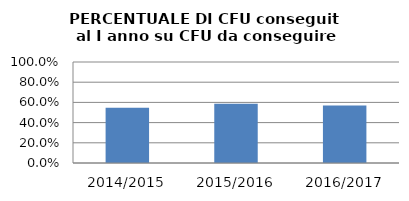
| Category | 2014/2015 2015/2016 2016/2017 |
|---|---|
| 2014/2015 | 0.548 |
| 2015/2016 | 0.587 |
| 2016/2017 | 0.57 |